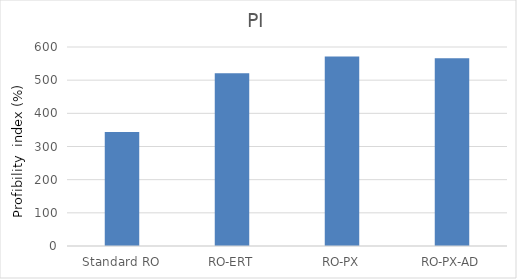
| Category | PI |
|---|---|
| Standard RO | 343.675 |
| RO-ERT | 521.135 |
| RO-PX | 571.019 |
| RO-PX-AD | 566.157 |